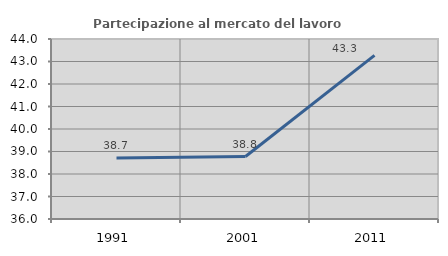
| Category | Partecipazione al mercato del lavoro  femminile |
|---|---|
| 1991.0 | 38.706 |
| 2001.0 | 38.777 |
| 2011.0 | 43.27 |